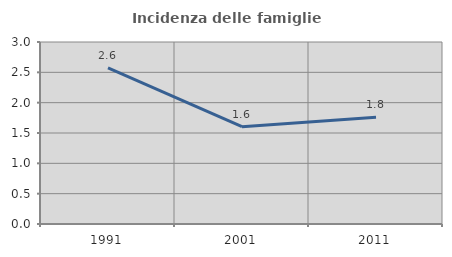
| Category | Incidenza delle famiglie numerose |
|---|---|
| 1991.0 | 2.575 |
| 2001.0 | 1.604 |
| 2011.0 | 1.76 |